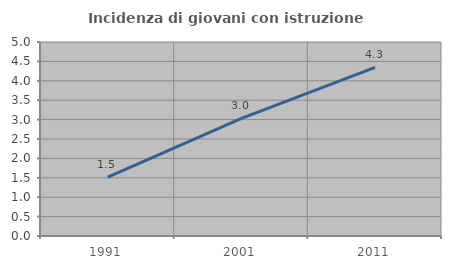
| Category | Incidenza di giovani con istruzione universitaria |
|---|---|
| 1991.0 | 1.515 |
| 2001.0 | 3.03 |
| 2011.0 | 4.348 |